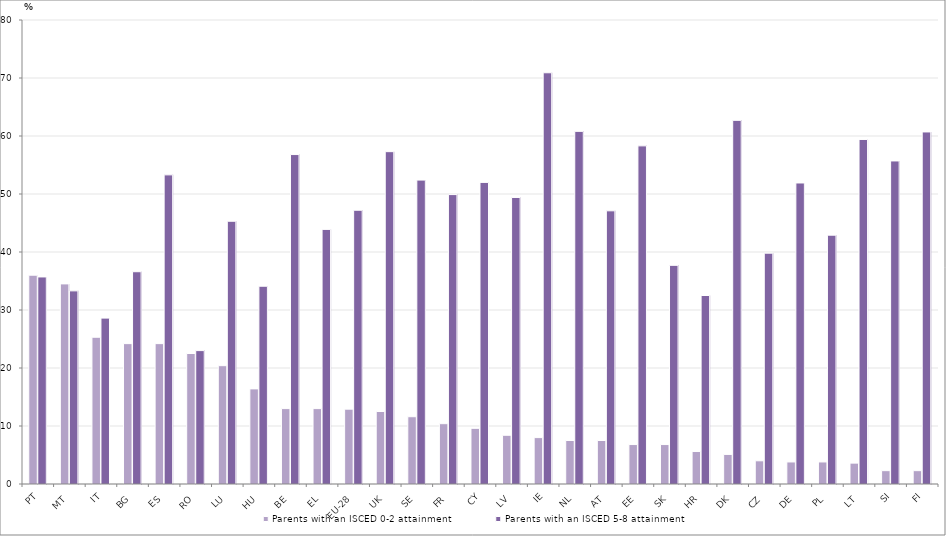
| Category | Parents with an ISCED 0-2 attainment | Parents with an ISCED 5-8 attainment |
|---|---|---|
| PT | 36 | 35.7 |
| MT | 34.5 | 33.3 |
| IT | 25.3 | 28.6 |
| BG | 24.2 | 36.6 |
| ES | 24.2 | 53.3 |
| RO | 22.5 | 23 |
| LU | 20.4 | 45.3 |
| HU | 16.4 | 34.1 |
| BE | 13 | 56.8 |
| EL | 13 | 43.9 |
| EU-28 | 12.9 | 47.2 |
| UK | 12.5 | 57.3 |
| SE | 11.6 | 52.4 |
| FR | 10.4 | 49.9 |
| CY | 9.6 | 52 |
| LV | 8.4 | 49.4 |
| IE | 8 | 70.9 |
| NL | 7.5 | 60.8 |
| AT | 7.5 | 47.1 |
| EE | 6.8 | 58.3 |
| SK | 6.8 | 37.7 |
| HR | 5.6 | 32.5 |
| DK | 5.1 | 62.7 |
| CZ | 4 | 39.8 |
| DE | 3.8 | 51.9 |
| PL | 3.8 | 42.9 |
| LT | 3.6 | 59.4 |
| SI | 2.3 | 55.7 |
| FI | 2.3 | 60.7 |